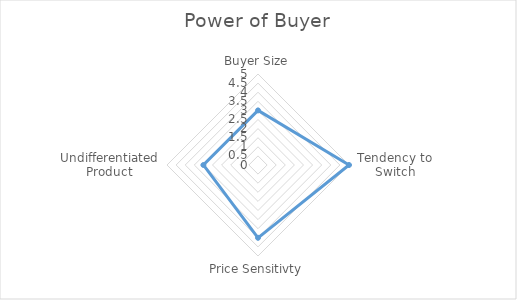
| Category | Series 0 |
|---|---|
| Buyer Size | 3 |
| Tendency to Switch | 5 |
| Price Sensitivty | 4 |
| Undifferentiated Product | 3 |